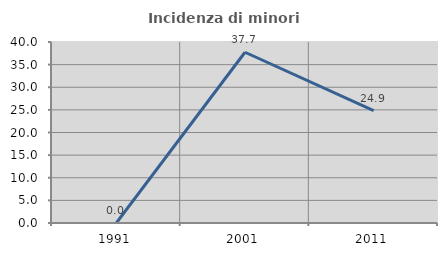
| Category | Incidenza di minori stranieri |
|---|---|
| 1991.0 | 0 |
| 2001.0 | 37.736 |
| 2011.0 | 24.852 |